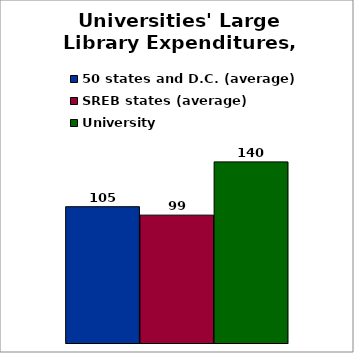
| Category | 50 states and D.C. (average) | SREB states (average) | University |
|---|---|---|---|
| 0 | 105.354 | 98.833 | 140 |